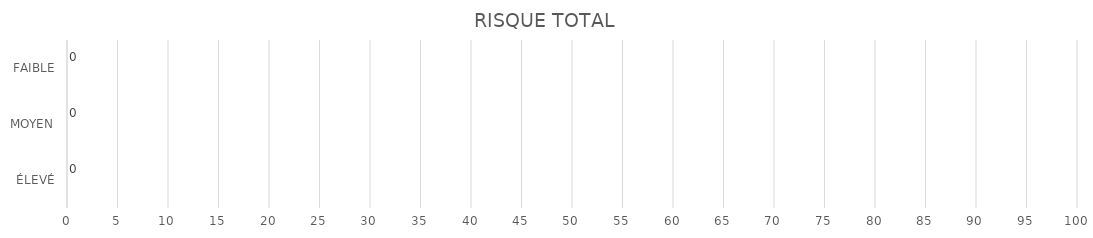
| Category | Series 1 | Series 0 |
|---|---|---|
| ÉLEVÉ | 0 | 0 |
| MOYEN | 0 | 0 |
| FAIBLE | 0 | 0 |